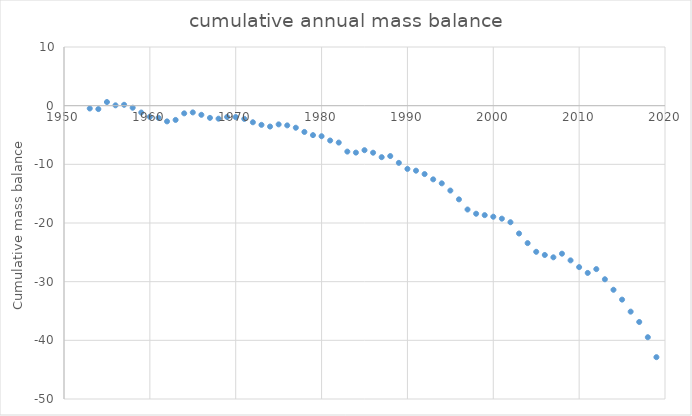
| Category | cumulative annual mass balance |
|---|---|
| 1953.0 | -0.48 |
| 1954.0 | -0.58 |
| 1955.0 | 0.62 |
| 1956.0 | 0.06 |
| 1957.0 | 0.15 |
| 1958.0 | -0.35 |
| 1959.0 | -1.17 |
| 1960.0 | -1.91 |
| 1961.0 | -2.07 |
| 1962.0 | -2.68 |
| 1963.0 | -2.43 |
| 1964.0 | -1.31 |
| 1965.0 | -1.15 |
| 1966.0 | -1.56 |
| 1967.0 | -2.08 |
| 1968.0 | -2.22 |
| 1969.0 | -1.93 |
| 1970.0 | -1.94 |
| 1971.0 | -2.26 |
| 1972.0 | -2.83 |
| 1973.0 | -3.27 |
| 1974.0 | -3.56 |
| 1975.0 | -3.19 |
| 1976.0 | -3.36 |
| 1977.0 | -3.76 |
| 1978.0 | -4.48 |
| 1979.0 | -5.02 |
| 1980.0 | -5.21 |
| 1981.0 | -5.94 |
| 1982.0 | -6.29 |
| 1983.0 | -7.83 |
| 1984.0 | -8 |
| 1985.0 | -7.59 |
| 1986.0 | -8.02 |
| 1987.0 | -8.78 |
| 1988.0 | -8.59 |
| 1989.0 | -9.75 |
| 1990.0 | -10.78 |
| 1991.0 | -11.08 |
| 1992.0 | -11.66 |
| 1993.0 | -12.56 |
| 1994.0 | -13.24 |
| 1995.0 | -14.47 |
| 1996.0 | -15.97 |
| 1997.0 | -17.7 |
| 1998.0 | -18.42 |
| 1999.0 | -18.66 |
| 2000.0 | -18.93 |
| 2001.0 | -19.26 |
| 2002.0 | -19.87 |
| 2003.0 | -21.79 |
| 2004.0 | -23.43 |
| 2005.0 | -24.91 |
| 2006.0 | -25.45 |
| 2007.0 | -25.85 |
| 2008.0 | -25.23 |
| 2009.0 | -26.37 |
| 2010.0 | -27.52 |
| 2011.0 | -28.51 |
| 2012.0 | -27.86 |
| 2013.0 | -29.59 |
| 2014.0 | -31.38 |
| 2015.0 | -33.06 |
| 2016.0 | -35.11 |
| 2017.0 | -36.87 |
| 2018.0 | -39.47 |
| 2019.0 | -42.87 |